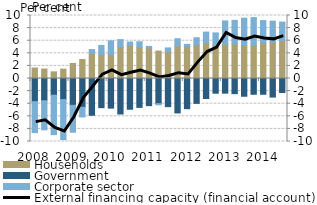
| Category | Households | Government | Corporate sector |
|---|---|---|---|
| 2008.0 | 1.667 | -3.681 | -4.907 |
| 2008.0 | 1.498 | -3.534 | -4.607 |
| 2008.0 | 1.055 | -2.654 | -6.261 |
| 2008.0 | 1.484 | -3.352 | -6.348 |
| 2009.0 | 2.381 | -4.26 | -4.266 |
| 2009.0 | 3.007 | -4.572 | -1.528 |
| 2009.0 | 3.999 | -5.832 | 0.59 |
| 2009.0 | 3.816 | -4.628 | 1.431 |
| 2010.0 | 3.85 | -4.7 | 2.132 |
| 2010.0 | 4.974 | -5.635 | 1.197 |
| 2010.0 | 5.235 | -4.88 | 0.559 |
| 2010.0 | 4.955 | -4.585 | 0.88 |
| 2011.0 | 4.831 | -4.31 | 0.264 |
| 2011.0 | 4.352 | -3.993 | -0.179 |
| 2011.0 | 4.262 | -4.467 | 0.594 |
| 2011.0 | 5.204 | -5.465 | 1.108 |
| 2012.0 | 5.099 | -4.788 | 0.323 |
| 2012.0 | 5.33 | -3.947 | 1.14 |
| 2012.0 | 5.65 | -3.176 | 1.716 |
| 2012.0 | 5.256 | -2.33 | 1.981 |
| 2013.0 | 5.41 | -2.321 | 3.736 |
| 2013.0 | 5.489 | -2.402 | 3.74 |
| 2013.0 | 5.252 | -2.818 | 4.321 |
| 2013.0 | 5.257 | -2.499 | 4.408 |
| 2014.0 | 5.631 | -2.504 | 3.564 |
| 2014.0 | 5.769 | -2.948 | 3.34 |
| 2014.0 | 6.015 | -2.227 | 2.939 |